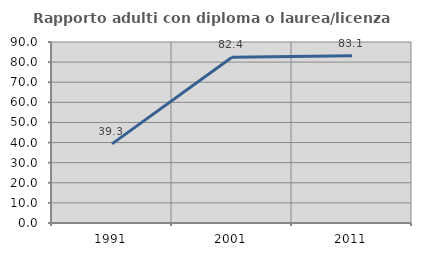
| Category | Rapporto adulti con diploma o laurea/licenza media  |
|---|---|
| 1991.0 | 39.344 |
| 2001.0 | 82.432 |
| 2011.0 | 83.146 |